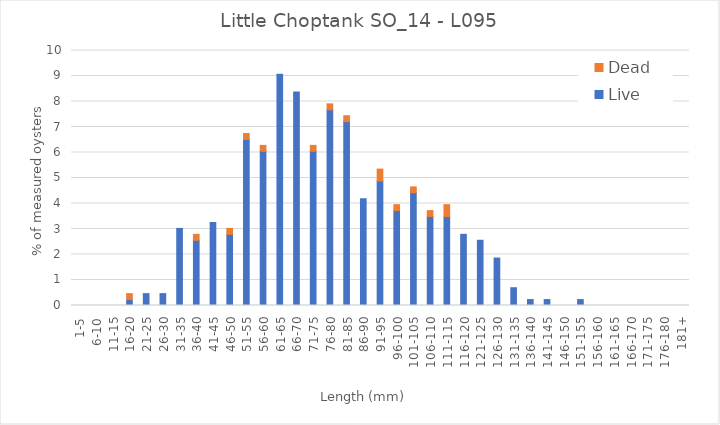
| Category | Live | Dead |
|---|---|---|
| 1-5 | 0 | 0 |
| 6-10 | 0 | 0 |
| 11-15 | 0 | 0 |
| 16-20 | 0.233 | 0.233 |
| 21-25 | 0.465 | 0 |
| 26-30 | 0.465 | 0 |
| 31-35 | 3.023 | 0 |
| 36-40 | 2.558 | 0.233 |
| 41-45 | 3.256 | 0 |
| 46-50 | 2.791 | 0.233 |
| 51-55 | 6.512 | 0.233 |
| 56-60 | 6.047 | 0.233 |
| 61-65 | 9.07 | 0 |
| 66-70 | 8.372 | 0 |
| 71-75 | 6.047 | 0.233 |
| 76-80 | 7.674 | 0.233 |
| 81-85 | 7.209 | 0.233 |
| 86-90 | 4.186 | 0 |
| 91-95 | 4.884 | 0.465 |
| 96-100 | 3.721 | 0.233 |
| 101-105 | 4.419 | 0.233 |
| 106-110 | 3.488 | 0.233 |
| 111-115 | 3.488 | 0.465 |
| 116-120 | 2.791 | 0 |
| 121-125 | 2.558 | 0 |
| 126-130 | 1.86 | 0 |
| 131-135 | 0.698 | 0 |
| 136-140 | 0.233 | 0 |
| 141-145 | 0.233 | 0 |
| 146-150 | 0 | 0 |
| 151-155 | 0.233 | 0 |
| 156-160 | 0 | 0 |
| 161-165 | 0 | 0 |
| 166-170 | 0 | 0 |
| 171-175 | 0 | 0 |
| 176-180 | 0 | 0 |
| 181+ | 0 | 0 |